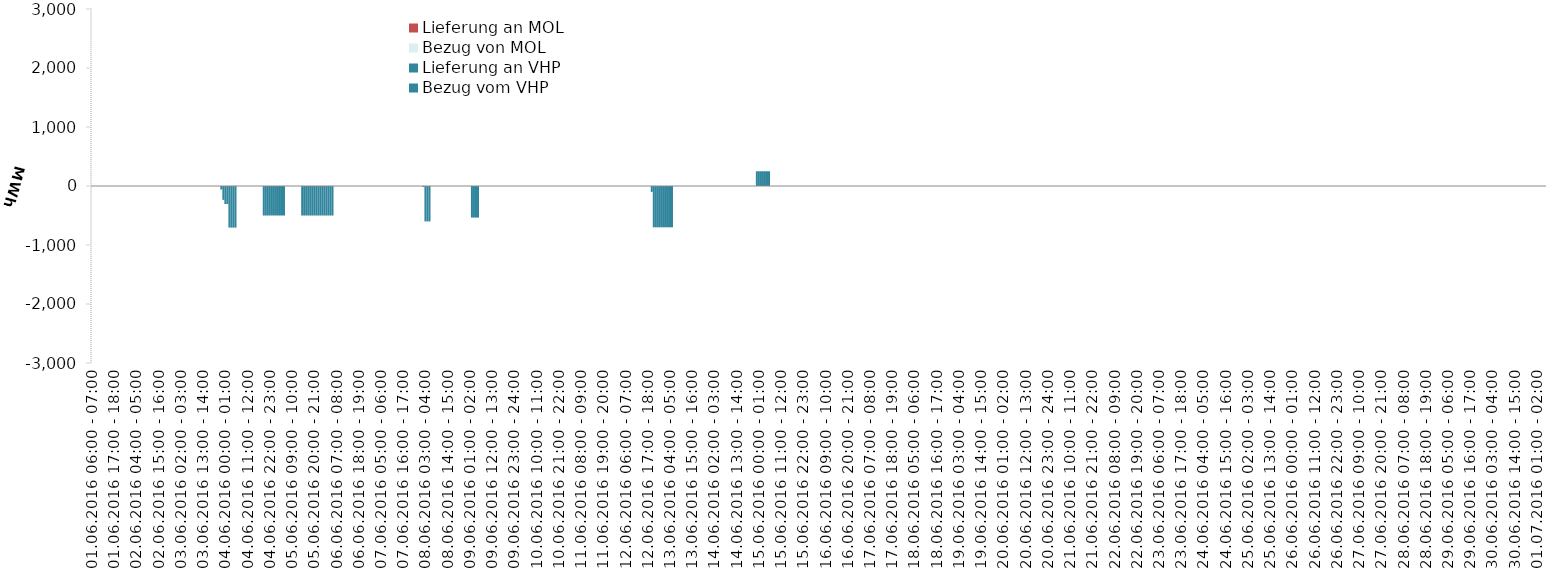
| Category | Bezug vom VHP | Lieferung an VHP | Bezug von MOL | Lieferung an MOL |
|---|---|---|---|---|
| 01.06.2016 06:00 - 07:00 | 0 | 0 | 0 | 0 |
| 01.06.2016 07:00 - 08:00 | 0 | 0 | 0 | 0 |
| 01.06.2016 08:00 - 09:00 | 0 | 0 | 0 | 0 |
| 01.06.2016 09:00 - 10:00 | 0 | 0 | 0 | 0 |
| 01.06.2016 10:00 - 11:00 | 0 | 0 | 0 | 0 |
| 01.06.2016 11:00 - 12:00 | 0 | 0 | 0 | 0 |
| 01.06.2016 12:00 - 13:00 | 0 | 0 | 0 | 0 |
| 01.06.2016 13:00 - 14:00 | 0 | 0 | 0 | 0 |
| 01.06.2016 14:00 - 15:00 | 0 | 0 | 0 | 0 |
| 01.06.2016 15:00 - 16:00 | 0 | 0 | 0 | 0 |
| 01.06.2016 16:00 - 17:00 | 0 | 0 | 0 | 0 |
| 01.06.2016 17:00 - 18:00 | 0 | 0 | 0 | 0 |
| 01.06.2016 18:00 - 19:00 | 0 | 0 | 0 | 0 |
| 01.06.2016 19:00 - 20:00 | 0 | 0 | 0 | 0 |
| 01.06.2016 20:00 - 21:00 | 0 | 0 | 0 | 0 |
| 01.06.2016 21:00 - 22:00 | 0 | 0 | 0 | 0 |
| 01.06.2016 22:00 - 23:00 | 0 | 0 | 0 | 0 |
| 01.06.2016 23:00 - 24:00 | 0 | 0 | 0 | 0 |
| 02.06.2016 00:00 - 01:00 | 0 | 0 | 0 | 0 |
| 02.06.2016 01:00 - 02:00 | 0 | 0 | 0 | 0 |
| 02.06.2016 02:00 - 03:00 | 0 | 0 | 0 | 0 |
| 02.06.2016 03:00 - 04:00 | 0 | 0 | 0 | 0 |
| 02.06.2016 04:00 - 05:00 | 0 | 0 | 0 | 0 |
| 02.06.2016 05:00 - 06:00 | 0 | 0 | 0 | 0 |
| 02.06.2016 06:00 - 07:00 | 0 | 0 | 0 | 0 |
| 02.06.2016 07:00 - 08:00 | 0 | 0 | 0 | 0 |
| 02.06.2016 08:00 - 09:00 | 0 | 0 | 0 | 0 |
| 02.06.2016 09:00 - 10:00 | 0 | 0 | 0 | 0 |
| 02.06.2016 10:00 - 11:00 | 0 | 0 | 0 | 0 |
| 02.06.2016 11:00 - 12:00 | 0 | 0 | 0 | 0 |
| 02.06.2016 12:00 - 13:00 | 0 | 0 | 0 | 0 |
| 02.06.2016 13:00 - 14:00 | 0 | 0 | 0 | 0 |
| 02.06.2016 14:00 - 15:00 | 0 | 0 | 0 | 0 |
| 02.06.2016 15:00 - 16:00 | 0 | 0 | 0 | 0 |
| 02.06.2016 16:00 - 17:00 | 0 | 0 | 0 | 0 |
| 02.06.2016 17:00 - 18:00 | 0 | 0 | 0 | 0 |
| 02.06.2016 18:00 - 19:00 | 0 | 0 | 0 | 0 |
| 02.06.2016 19:00 - 20:00 | 0 | 0 | 0 | 0 |
| 02.06.2016 20:00 - 21:00 | 0 | 0 | 0 | 0 |
| 02.06.2016 21:00 - 22:00 | 0 | 0 | 0 | 0 |
| 02.06.2016 22:00 - 23:00 | 0 | 0 | 0 | 0 |
| 02.06.2016 23:00 - 24:00 | 0 | 0 | 0 | 0 |
| 03.06.2016 00:00 - 01:00 | 0 | 0 | 0 | 0 |
| 03.06.2016 01:00 - 02:00 | 0 | 0 | 0 | 0 |
| 03.06.2016 02:00 - 03:00 | 0 | 0 | 0 | 0 |
| 03.06.2016 03:00 - 04:00 | 0 | 0 | 0 | 0 |
| 03.06.2016 04:00 - 05:00 | 0 | 0 | 0 | 0 |
| 03.06.2016 05:00 - 06:00 | 0 | 0 | 0 | 0 |
| 03.06.2016 06:00 - 07:00 | 0 | 0 | 0 | 0 |
| 03.06.2016 07:00 - 08:00 | 0 | 0 | 0 | 0 |
| 03.06.2016 08:00 - 09:00 | 0 | 0 | 0 | 0 |
| 03.06.2016 09:00 - 10:00 | 0 | 0 | 0 | 0 |
| 03.06.2016 10:00 - 11:00 | 0 | 0 | 0 | 0 |
| 03.06.2016 11:00 - 12:00 | 0 | 0 | 0 | 0 |
| 03.06.2016 12:00 - 13:00 | 0 | 0 | 0 | 0 |
| 03.06.2016 13:00 - 14:00 | 0 | 0 | 0 | 0 |
| 03.06.2016 14:00 - 15:00 | 0 | 0 | 0 | 0 |
| 03.06.2016 15:00 - 16:00 | 0 | 0 | 0 | 0 |
| 03.06.2016 16:00 - 17:00 | 0 | 0 | 0 | 0 |
| 03.06.2016 17:00 - 18:00 | 0 | 0 | 0 | 0 |
| 03.06.2016 18:00 - 19:00 | 0 | 0 | 0 | 0 |
| 03.06.2016 19:00 - 20:00 | 0 | 0 | 0 | 0 |
| 03.06.2016 20:00 - 21:00 | 0 | 0 | 0 | 0 |
| 03.06.2016 21:00 - 22:00 | 0 | 0 | 0 | 0 |
| 03.06.2016 22:00 - 23:00 | 0 | -60 | 0 | 0 |
| 03.06.2016 23:00 - 24:00 | 0 | -235 | 0 | 0 |
| 04.06.2016 00:00 - 01:00 | 0 | -305 | 0 | 0 |
| 04.06.2016 01:00 - 02:00 | 0 | -305 | 0 | 0 |
| 04.06.2016 02:00 - 03:00 | 0 | -705 | 0 | 0 |
| 04.06.2016 03:00 - 04:00 | 0 | -705 | 0 | 0 |
| 04.06.2016 04:00 - 05:00 | 0 | -705 | 0 | 0 |
| 04.06.2016 05:00 - 06:00 | 0 | -705 | 0 | 0 |
| 04.06.2016 06:00 - 07:00 | 0 | 0 | 0 | 0 |
| 04.06.2016 07:00 - 08:00 | 0 | 0 | 0 | 0 |
| 04.06.2016 08:00 - 09:00 | 0 | 0 | 0 | 0 |
| 04.06.2016 09:00 - 10:00 | 0 | 0 | 0 | 0 |
| 04.06.2016 10:00 - 11:00 | 0 | 0 | 0 | 0 |
| 04.06.2016 11:00 - 12:00 | 0 | 0 | 0 | 0 |
| 04.06.2016 12:00 - 13:00 | 0 | 0 | 0 | 0 |
| 04.06.2016 13:00 - 14:00 | 0 | 0 | 0 | 0 |
| 04.06.2016 14:00 - 15:00 | 0 | 0 | 0 | 0 |
| 04.06.2016 15:00 - 16:00 | 0 | 0 | 0 | 0 |
| 04.06.2016 16:00 - 17:00 | 0 | 0 | 0 | 0 |
| 04.06.2016 17:00 - 18:00 | 0 | 0 | 0 | 0 |
| 04.06.2016 18:00 - 19:00 | 0 | 0 | 0 | 0 |
| 04.06.2016 19:00 - 20:00 | 0 | -500 | 0 | 0 |
| 04.06.2016 20:00 - 21:00 | 0 | -500 | 0 | 0 |
| 04.06.2016 21:00 - 22:00 | 0 | -500 | 0 | 0 |
| 04.06.2016 22:00 - 23:00 | 0 | -500 | 0 | 0 |
| 04.06.2016 23:00 - 24:00 | 0 | -500 | 0 | 0 |
| 05.06.2016 00:00 - 01:00 | 0 | -500 | 0 | 0 |
| 05.06.2016 01:00 - 02:00 | 0 | -500 | 0 | 0 |
| 05.06.2016 02:00 - 03:00 | 0 | -500 | 0 | 0 |
| 05.06.2016 03:00 - 04:00 | 0 | -500 | 0 | 0 |
| 05.06.2016 04:00 - 05:00 | 0 | -500 | 0 | 0 |
| 05.06.2016 05:00 - 06:00 | 0 | -500 | 0 | 0 |
| 05.06.2016 06:00 - 07:00 | 0 | 0 | 0 | 0 |
| 05.06.2016 07:00 - 08:00 | 0 | 0 | 0 | 0 |
| 05.06.2016 08:00 - 09:00 | 0 | 0 | 0 | 0 |
| 05.06.2016 09:00 - 10:00 | 0 | 0 | 0 | 0 |
| 05.06.2016 10:00 - 11:00 | 0 | 0 | 0 | 0 |
| 05.06.2016 11:00 - 12:00 | 0 | 0 | 0 | 0 |
| 05.06.2016 12:00 - 13:00 | 0 | 0 | 0 | 0 |
| 05.06.2016 13:00 - 14:00 | 0 | 0 | 0 | 0 |
| 05.06.2016 14:00 - 15:00 | 0 | -500 | 0 | 0 |
| 05.06.2016 15:00 - 16:00 | 0 | -500 | 0 | 0 |
| 05.06.2016 16:00 - 17:00 | 0 | -500 | 0 | 0 |
| 05.06.2016 17:00 - 18:00 | 0 | -500 | 0 | 0 |
| 05.06.2016 18:00 - 19:00 | 0 | -500 | 0 | 0 |
| 05.06.2016 19:00 - 20:00 | 0 | -500 | 0 | 0 |
| 05.06.2016 20:00 - 21:00 | 0 | -500 | 0 | 0 |
| 05.06.2016 21:00 - 22:00 | 0 | -500 | 0 | 0 |
| 05.06.2016 22:00 - 23:00 | 0 | -500 | 0 | 0 |
| 05.06.2016 23:00 - 24:00 | 0 | -500 | 0 | 0 |
| 06.06.2016 00:00 - 01:00 | 0 | -500 | 0 | 0 |
| 06.06.2016 01:00 - 02:00 | 0 | -500 | 0 | 0 |
| 06.06.2016 02:00 - 03:00 | 0 | -500 | 0 | 0 |
| 06.06.2016 03:00 - 04:00 | 0 | -500 | 0 | 0 |
| 06.06.2016 04:00 - 05:00 | 0 | -500 | 0 | 0 |
| 06.06.2016 05:00 - 06:00 | 0 | -500 | 0 | 0 |
| 06.06.2016 06:00 - 07:00 | 0 | 0 | 0 | 0 |
| 06.06.2016 07:00 - 08:00 | 0 | 0 | 0 | 0 |
| 06.06.2016 08:00 - 09:00 | 0 | 0 | 0 | 0 |
| 06.06.2016 09:00 - 10:00 | 0 | 0 | 0 | 0 |
| 06.06.2016 10:00 - 11:00 | 0 | 0 | 0 | 0 |
| 06.06.2016 11:00 - 12:00 | 0 | 0 | 0 | 0 |
| 06.06.2016 12:00 - 13:00 | 0 | 0 | 0 | 0 |
| 06.06.2016 13:00 - 14:00 | 0 | 0 | 0 | 0 |
| 06.06.2016 14:00 - 15:00 | 0 | 0 | 0 | 0 |
| 06.06.2016 15:00 - 16:00 | 0 | 0 | 0 | 0 |
| 06.06.2016 16:00 - 17:00 | 0 | 0 | 0 | 0 |
| 06.06.2016 17:00 - 18:00 | 0 | 0 | 0 | 0 |
| 06.06.2016 18:00 - 19:00 | 0 | 0 | 0 | 0 |
| 06.06.2016 19:00 - 20:00 | 0 | 0 | 0 | 0 |
| 06.06.2016 20:00 - 21:00 | 0 | 0 | 0 | 0 |
| 06.06.2016 21:00 - 22:00 | 0 | 0 | 0 | 0 |
| 06.06.2016 22:00 - 23:00 | 0 | 0 | 0 | 0 |
| 06.06.2016 23:00 - 24:00 | 0 | 0 | 0 | 0 |
| 07.06.2016 00:00 - 01:00 | 0 | 0 | 0 | 0 |
| 07.06.2016 01:00 - 02:00 | 0 | 0 | 0 | 0 |
| 07.06.2016 02:00 - 03:00 | 0 | 0 | 0 | 0 |
| 07.06.2016 03:00 - 04:00 | 0 | 0 | 0 | 0 |
| 07.06.2016 04:00 - 05:00 | 0 | 0 | 0 | 0 |
| 07.06.2016 05:00 - 06:00 | 0 | 0 | 0 | 0 |
| 07.06.2016 06:00 - 07:00 | 0 | 0 | 0 | 0 |
| 07.06.2016 07:00 - 08:00 | 0 | 0 | 0 | 0 |
| 07.06.2016 08:00 - 09:00 | 0 | 0 | 0 | 0 |
| 07.06.2016 09:00 - 10:00 | 0 | 0 | 0 | 0 |
| 07.06.2016 10:00 - 11:00 | 0 | 0 | 0 | 0 |
| 07.06.2016 11:00 - 12:00 | 0 | 0 | 0 | 0 |
| 07.06.2016 12:00 - 13:00 | 0 | 0 | 0 | 0 |
| 07.06.2016 13:00 - 14:00 | 0 | 0 | 0 | 0 |
| 07.06.2016 14:00 - 15:00 | 0 | 0 | 0 | 0 |
| 07.06.2016 15:00 - 16:00 | 0 | 0 | 0 | 0 |
| 07.06.2016 16:00 - 17:00 | 0 | 0 | 0 | 0 |
| 07.06.2016 17:00 - 18:00 | 0 | 0 | 0 | 0 |
| 07.06.2016 18:00 - 19:00 | 0 | 0 | 0 | 0 |
| 07.06.2016 19:00 - 20:00 | 0 | 0 | 0 | 0 |
| 07.06.2016 20:00 - 21:00 | 0 | 0 | 0 | 0 |
| 07.06.2016 21:00 - 22:00 | 0 | 0 | 0 | 0 |
| 07.06.2016 22:00 - 23:00 | 0 | 0 | 0 | 0 |
| 07.06.2016 23:00 - 24:00 | 0 | 0 | 0 | 0 |
| 08.06.2016 00:00 - 01:00 | 0 | 0 | 0 | 0 |
| 08.06.2016 01:00 - 02:00 | 0 | 0 | 0 | 0 |
| 08.06.2016 02:00 - 03:00 | 0 | -16 | 0 | 0 |
| 08.06.2016 03:00 - 04:00 | 0 | -600 | 0 | 0 |
| 08.06.2016 04:00 - 05:00 | 0 | -600 | 0 | 0 |
| 08.06.2016 05:00 - 06:00 | 0 | -600 | 0 | 0 |
| 08.06.2016 06:00 - 07:00 | 0 | 0 | 0 | 0 |
| 08.06.2016 07:00 - 08:00 | 0 | 0 | 0 | 0 |
| 08.06.2016 08:00 - 09:00 | 0 | 0 | 0 | 0 |
| 08.06.2016 09:00 - 10:00 | 0 | 0 | 0 | 0 |
| 08.06.2016 10:00 - 11:00 | 0 | 0 | 0 | 0 |
| 08.06.2016 11:00 - 12:00 | 0 | 0 | 0 | 0 |
| 08.06.2016 12:00 - 13:00 | 0 | 0 | 0 | 0 |
| 08.06.2016 13:00 - 14:00 | 0 | 0 | 0 | 0 |
| 08.06.2016 14:00 - 15:00 | 0 | 0 | 0 | 0 |
| 08.06.2016 15:00 - 16:00 | 0 | 0 | 0 | 0 |
| 08.06.2016 16:00 - 17:00 | 0 | 0 | 0 | 0 |
| 08.06.2016 17:00 - 18:00 | 0 | 0 | 0 | 0 |
| 08.06.2016 18:00 - 19:00 | 0 | 0 | 0 | 0 |
| 08.06.2016 19:00 - 20:00 | 0 | 0 | 0 | 0 |
| 08.06.2016 20:00 - 21:00 | 0 | 0 | 0 | 0 |
| 08.06.2016 21:00 - 22:00 | 0 | 0 | 0 | 0 |
| 08.06.2016 22:00 - 23:00 | 0 | 0 | 0 | 0 |
| 08.06.2016 23:00 - 24:00 | 0 | 0 | 0 | 0 |
| 09.06.2016 00:00 - 01:00 | 0 | 0 | 0 | 0 |
| 09.06.2016 01:00 - 02:00 | 0 | 0 | 0 | 0 |
| 09.06.2016 02:00 - 03:00 | 0 | -535 | 0 | 0 |
| 09.06.2016 03:00 - 04:00 | 0 | -535 | 0 | 0 |
| 09.06.2016 04:00 - 05:00 | 0 | -535 | 0 | 0 |
| 09.06.2016 05:00 - 06:00 | 0 | -535 | 0 | 0 |
| 09.06.2016 06:00 - 07:00 | 0 | 0 | 0 | 0 |
| 09.06.2016 07:00 - 08:00 | 0 | 0 | 0 | 0 |
| 09.06.2016 08:00 - 09:00 | 0 | 0 | 0 | 0 |
| 09.06.2016 09:00 - 10:00 | 0 | 0 | 0 | 0 |
| 09.06.2016 10:00 - 11:00 | 0 | 0 | 0 | 0 |
| 09.06.2016 11:00 - 12:00 | 0 | 0 | 0 | 0 |
| 09.06.2016 12:00 - 13:00 | 0 | 0 | 0 | 0 |
| 09.06.2016 13:00 - 14:00 | 0 | 0 | 0 | 0 |
| 09.06.2016 14:00 - 15:00 | 0 | 0 | 0 | 0 |
| 09.06.2016 15:00 - 16:00 | 0 | 0 | 0 | 0 |
| 09.06.2016 16:00 - 17:00 | 0 | 0 | 0 | 0 |
| 09.06.2016 17:00 - 18:00 | 0 | 0 | 0 | 0 |
| 09.06.2016 18:00 - 19:00 | 0 | 0 | 0 | 0 |
| 09.06.2016 19:00 - 20:00 | 0 | 0 | 0 | 0 |
| 09.06.2016 20:00 - 21:00 | 0 | 0 | 0 | 0 |
| 09.06.2016 21:00 - 22:00 | 0 | 0 | 0 | 0 |
| 09.06.2016 22:00 - 23:00 | 0 | 0 | 0 | 0 |
| 09.06.2016 23:00 - 24:00 | 0 | 0 | 0 | 0 |
| 10.06.2016 00:00 - 01:00 | 0 | 0 | 0 | 0 |
| 10.06.2016 01:00 - 02:00 | 0 | 0 | 0 | 0 |
| 10.06.2016 02:00 - 03:00 | 0 | 0 | 0 | 0 |
| 10.06.2016 03:00 - 04:00 | 0 | 0 | 0 | 0 |
| 10.06.2016 04:00 - 05:00 | 0 | 0 | 0 | 0 |
| 10.06.2016 05:00 - 06:00 | 0 | 0 | 0 | 0 |
| 10.06.2016 06:00 - 07:00 | 0 | 0 | 0 | 0 |
| 10.06.2016 07:00 - 08:00 | 0 | 0 | 0 | 0 |
| 10.06.2016 08:00 - 09:00 | 0 | 0 | 0 | 0 |
| 10.06.2016 09:00 - 10:00 | 0 | 0 | 0 | 0 |
| 10.06.2016 10:00 - 11:00 | 0 | 0 | 0 | 0 |
| 10.06.2016 11:00 - 12:00 | 0 | 0 | 0 | 0 |
| 10.06.2016 12:00 - 13:00 | 0 | 0 | 0 | 0 |
| 10.06.2016 13:00 - 14:00 | 0 | 0 | 0 | 0 |
| 10.06.2016 14:00 - 15:00 | 0 | 0 | 0 | 0 |
| 10.06.2016 15:00 - 16:00 | 0 | 0 | 0 | 0 |
| 10.06.2016 16:00 - 17:00 | 0 | 0 | 0 | 0 |
| 10.06.2016 17:00 - 18:00 | 0 | 0 | 0 | 0 |
| 10.06.2016 18:00 - 19:00 | 0 | 0 | 0 | 0 |
| 10.06.2016 19:00 - 20:00 | 0 | 0 | 0 | 0 |
| 10.06.2016 20:00 - 21:00 | 0 | 0 | 0 | 0 |
| 10.06.2016 21:00 - 22:00 | 0 | 0 | 0 | 0 |
| 10.06.2016 22:00 - 23:00 | 0 | 0 | 0 | 0 |
| 10.06.2016 23:00 - 24:00 | 0 | 0 | 0 | 0 |
| 11.06.2016 00:00 - 01:00 | 0 | 0 | 0 | 0 |
| 11.06.2016 01:00 - 02:00 | 0 | 0 | 0 | 0 |
| 11.06.2016 02:00 - 03:00 | 0 | 0 | 0 | 0 |
| 11.06.2016 03:00 - 04:00 | 0 | 0 | 0 | 0 |
| 11.06.2016 04:00 - 05:00 | 0 | 0 | 0 | 0 |
| 11.06.2016 05:00 - 06:00 | 0 | 0 | 0 | 0 |
| 11.06.2016 06:00 - 07:00 | 0 | 0 | 0 | 0 |
| 11.06.2016 07:00 - 08:00 | 0 | 0 | 0 | 0 |
| 11.06.2016 08:00 - 09:00 | 0 | 0 | 0 | 0 |
| 11.06.2016 09:00 - 10:00 | 0 | 0 | 0 | 0 |
| 11.06.2016 10:00 - 11:00 | 0 | 0 | 0 | 0 |
| 11.06.2016 11:00 - 12:00 | 0 | 0 | 0 | 0 |
| 11.06.2016 12:00 - 13:00 | 0 | 0 | 0 | 0 |
| 11.06.2016 13:00 - 14:00 | 0 | 0 | 0 | 0 |
| 11.06.2016 14:00 - 15:00 | 0 | 0 | 0 | 0 |
| 11.06.2016 15:00 - 16:00 | 0 | 0 | 0 | 0 |
| 11.06.2016 16:00 - 17:00 | 0 | 0 | 0 | 0 |
| 11.06.2016 17:00 - 18:00 | 0 | 0 | 0 | 0 |
| 11.06.2016 18:00 - 19:00 | 0 | 0 | 0 | 0 |
| 11.06.2016 19:00 - 20:00 | 0 | 0 | 0 | 0 |
| 11.06.2016 20:00 - 21:00 | 0 | 0 | 0 | 0 |
| 11.06.2016 21:00 - 22:00 | 0 | 0 | 0 | 0 |
| 11.06.2016 22:00 - 23:00 | 0 | 0 | 0 | 0 |
| 11.06.2016 23:00 - 24:00 | 0 | 0 | 0 | 0 |
| 12.06.2016 00:00 - 01:00 | 0 | 0 | 0 | 0 |
| 12.06.2016 01:00 - 02:00 | 0 | 0 | 0 | 0 |
| 12.06.2016 02:00 - 03:00 | 0 | 0 | 0 | 0 |
| 12.06.2016 03:00 - 04:00 | 0 | 0 | 0 | 0 |
| 12.06.2016 04:00 - 05:00 | 0 | 0 | 0 | 0 |
| 12.06.2016 05:00 - 06:00 | 0 | 0 | 0 | 0 |
| 12.06.2016 06:00 - 07:00 | 0 | 0 | 0 | 0 |
| 12.06.2016 07:00 - 08:00 | 0 | 0 | 0 | 0 |
| 12.06.2016 08:00 - 09:00 | 0 | 0 | 0 | 0 |
| 12.06.2016 09:00 - 10:00 | 0 | 0 | 0 | 0 |
| 12.06.2016 10:00 - 11:00 | 0 | 0 | 0 | 0 |
| 12.06.2016 11:00 - 12:00 | 0 | 0 | 0 | 0 |
| 12.06.2016 12:00 - 13:00 | 0 | 0 | 0 | 0 |
| 12.06.2016 13:00 - 14:00 | 0 | 0 | 0 | 0 |
| 12.06.2016 14:00 - 15:00 | 0 | 0 | 0 | 0 |
| 12.06.2016 15:00 - 16:00 | 0 | 0 | 0 | 0 |
| 12.06.2016 16:00 - 17:00 | 0 | 0 | 0 | 0 |
| 12.06.2016 17:00 - 18:00 | 0 | 0 | 0 | 0 |
| 12.06.2016 18:00 - 19:00 | 0 | 0 | 0 | 0 |
| 12.06.2016 19:00 - 20:00 | 0 | -100 | 0 | 0 |
| 12.06.2016 20:00 - 21:00 | 0 | -700 | 0 | 0 |
| 12.06.2016 21:00 - 22:00 | 0 | -700 | 0 | 0 |
| 12.06.2016 22:00 - 23:00 | 0 | -700 | 0 | 0 |
| 12.06.2016 23:00 - 24:00 | 0 | -700 | 0 | 0 |
| 13.06.2016 00:00 - 01:00 | 0 | -700 | 0 | 0 |
| 13.06.2016 01:00 - 02:00 | 0 | -700 | 0 | 0 |
| 13.06.2016 02:00 - 03:00 | 0 | -700 | 0 | 0 |
| 13.06.2016 03:00 - 04:00 | 0 | -700 | 0 | 0 |
| 13.06.2016 04:00 - 05:00 | 0 | -700 | 0 | 0 |
| 13.06.2016 05:00 - 06:00 | 0 | -700 | 0 | 0 |
| 13.06.2016 06:00 - 07:00 | 0 | 0 | 0 | 0 |
| 13.06.2016 07:00 - 08:00 | 0 | 0 | 0 | 0 |
| 13.06.2016 08:00 - 09:00 | 0 | 0 | 0 | 0 |
| 13.06.2016 09:00 - 10:00 | 0 | 0 | 0 | 0 |
| 13.06.2016 10:00 - 11:00 | 0 | 0 | 0 | 0 |
| 13.06.2016 11:00 - 12:00 | 0 | 0 | 0 | 0 |
| 13.06.2016 12:00 - 13:00 | 0 | 0 | 0 | 0 |
| 13.06.2016 13:00 - 14:00 | 0 | 0 | 0 | 0 |
| 13.06.2016 14:00 - 15:00 | 0 | 0 | 0 | 0 |
| 13.06.2016 15:00 - 16:00 | 0 | 0 | 0 | 0 |
| 13.06.2016 16:00 - 17:00 | 0 | 0 | 0 | 0 |
| 13.06.2016 17:00 - 18:00 | 0 | 0 | 0 | 0 |
| 13.06.2016 18:00 - 19:00 | 0 | 0 | 0 | 0 |
| 13.06.2016 19:00 - 20:00 | 0 | 0 | 0 | 0 |
| 13.06.2016 20:00 - 21:00 | 0 | 0 | 0 | 0 |
| 13.06.2016 21:00 - 22:00 | 0 | 0 | 0 | 0 |
| 13.06.2016 22:00 - 23:00 | 0 | 0 | 0 | 0 |
| 13.06.2016 23:00 - 24:00 | 0 | 0 | 0 | 0 |
| 14.06.2016 00:00 - 01:00 | 0 | 0 | 0 | 0 |
| 14.06.2016 01:00 - 02:00 | 0 | 0 | 0 | 0 |
| 14.06.2016 02:00 - 03:00 | 0 | 0 | 0 | 0 |
| 14.06.2016 03:00 - 04:00 | 0 | 0 | 0 | 0 |
| 14.06.2016 04:00 - 05:00 | 0 | 0 | 0 | 0 |
| 14.06.2016 05:00 - 06:00 | 0 | 0 | 0 | 0 |
| 14.06.2016 06:00 - 07:00 | 0 | 0 | 0 | 0 |
| 14.06.2016 07:00 - 08:00 | 0 | 0 | 0 | 0 |
| 14.06.2016 08:00 - 09:00 | 0 | 0 | 0 | 0 |
| 14.06.2016 09:00 - 10:00 | 0 | 0 | 0 | 0 |
| 14.06.2016 10:00 - 11:00 | 0 | 0 | 0 | 0 |
| 14.06.2016 11:00 - 12:00 | 0 | 0 | 0 | 0 |
| 14.06.2016 12:00 - 13:00 | 0 | 0 | 0 | 0 |
| 14.06.2016 13:00 - 14:00 | 0 | 0 | 0 | 0 |
| 14.06.2016 14:00 - 15:00 | 0 | 0 | 0 | 0 |
| 14.06.2016 15:00 - 16:00 | 0 | 0 | 0 | 0 |
| 14.06.2016 16:00 - 17:00 | 0 | 0 | 0 | 0 |
| 14.06.2016 17:00 - 18:00 | 0 | 0 | 0 | 0 |
| 14.06.2016 18:00 - 19:00 | 0 | 0 | 0 | 0 |
| 14.06.2016 19:00 - 20:00 | 0 | 0 | 0 | 0 |
| 14.06.2016 20:00 - 21:00 | 0 | 0 | 0 | 0 |
| 14.06.2016 21:00 - 22:00 | 0 | 0 | 0 | 0 |
| 14.06.2016 22:00 - 23:00 | 0 | 0 | 0 | 0 |
| 14.06.2016 23:00 - 24:00 | 250 | 0 | 0 | 0 |
| 15.06.2016 00:00 - 01:00 | 250 | 0 | 0 | 0 |
| 15.06.2016 01:00 - 02:00 | 250 | 0 | 0 | 0 |
| 15.06.2016 02:00 - 03:00 | 250 | 0 | 0 | 0 |
| 15.06.2016 03:00 - 04:00 | 250 | 0 | 0 | 0 |
| 15.06.2016 04:00 - 05:00 | 250 | 0 | 0 | 0 |
| 15.06.2016 05:00 - 06:00 | 250 | 0 | 0 | 0 |
| 15.06.2016 06:00 - 07:00 | 0 | 0 | 0 | 0 |
| 15.06.2016 07:00 - 08:00 | 0 | 0 | 0 | 0 |
| 15.06.2016 08:00 - 09:00 | 0 | 0 | 0 | 0 |
| 15.06.2016 09:00 - 10:00 | 0 | 0 | 0 | 0 |
| 15.06.2016 10:00 - 11:00 | 0 | 0 | 0 | 0 |
| 15.06.2016 11:00 - 12:00 | 0 | 0 | 0 | 0 |
| 15.06.2016 12:00 - 13:00 | 0 | 0 | 0 | 0 |
| 15.06.2016 13:00 - 14:00 | 0 | 0 | 0 | 0 |
| 15.06.2016 14:00 - 15:00 | 0 | 0 | 0 | 0 |
| 15.06.2016 15:00 - 16:00 | 0 | 0 | 0 | 0 |
| 15.06.2016 16:00 - 17:00 | 0 | 0 | 0 | 0 |
| 15.06.2016 17:00 - 18:00 | 0 | 0 | 0 | 0 |
| 15.06.2016 18:00 - 19:00 | 0 | 0 | 0 | 0 |
| 15.06.2016 19:00 - 20:00 | 0 | 0 | 0 | 0 |
| 15.06.2016 20:00 - 21:00 | 0 | 0 | 0 | 0 |
| 15.06.2016 21:00 - 22:00 | 0 | 0 | 0 | 0 |
| 15.06.2016 22:00 - 23:00 | 0 | 0 | 0 | 0 |
| 15.06.2016 23:00 - 24:00 | 0 | 0 | 0 | 0 |
| 16.06.2016 00:00 - 01:00 | 0 | 0 | 0 | 0 |
| 16.06.2016 01:00 - 02:00 | 0 | 0 | 0 | 0 |
| 16.06.2016 02:00 - 03:00 | 0 | 0 | 0 | 0 |
| 16.06.2016 03:00 - 04:00 | 0 | 0 | 0 | 0 |
| 16.06.2016 04:00 - 05:00 | 0 | 0 | 0 | 0 |
| 16.06.2016 05:00 - 06:00 | 0 | 0 | 0 | 0 |
| 16.06.2016 06:00 - 07:00 | 0 | 0 | 0 | 0 |
| 16.06.2016 07:00 - 08:00 | 0 | 0 | 0 | 0 |
| 16.06.2016 08:00 - 09:00 | 0 | 0 | 0 | 0 |
| 16.06.2016 09:00 - 10:00 | 0 | 0 | 0 | 0 |
| 16.06.2016 10:00 - 11:00 | 0 | 0 | 0 | 0 |
| 16.06.2016 11:00 - 12:00 | 0 | 0 | 0 | 0 |
| 16.06.2016 12:00 - 13:00 | 0 | 0 | 0 | 0 |
| 16.06.2016 13:00 - 14:00 | 0 | 0 | 0 | 0 |
| 16.06.2016 14:00 - 15:00 | 0 | 0 | 0 | 0 |
| 16.06.2016 15:00 - 16:00 | 0 | 0 | 0 | 0 |
| 16.06.2016 16:00 - 17:00 | 0 | 0 | 0 | 0 |
| 16.06.2016 17:00 - 18:00 | 0 | 0 | 0 | 0 |
| 16.06.2016 18:00 - 19:00 | 0 | 0 | 0 | 0 |
| 16.06.2016 19:00 - 20:00 | 0 | 0 | 0 | 0 |
| 16.06.2016 20:00 - 21:00 | 0 | 0 | 0 | 0 |
| 16.06.2016 21:00 - 22:00 | 0 | 0 | 0 | 0 |
| 16.06.2016 22:00 - 23:00 | 0 | 0 | 0 | 0 |
| 16.06.2016 23:00 - 24:00 | 0 | 0 | 0 | 0 |
| 17.06.2016 00:00 - 01:00 | 0 | 0 | 0 | 0 |
| 17.06.2016 01:00 - 02:00 | 0 | 0 | 0 | 0 |
| 17.06.2016 02:00 - 03:00 | 0 | 0 | 0 | 0 |
| 17.06.2016 03:00 - 04:00 | 0 | 0 | 0 | 0 |
| 17.06.2016 04:00 - 05:00 | 0 | 0 | 0 | 0 |
| 17.06.2016 05:00 - 06:00 | 0 | 0 | 0 | 0 |
| 17.06.2016 06:00 - 07:00 | 0 | 0 | 0 | 0 |
| 17.06.2016 07:00 - 08:00 | 0 | 0 | 0 | 0 |
| 17.06.2016 08:00 - 09:00 | 0 | 0 | 0 | 0 |
| 17.06.2016 09:00 - 10:00 | 0 | 0 | 0 | 0 |
| 17.06.2016 10:00 - 11:00 | 0 | 0 | 0 | 0 |
| 17.06.2016 11:00 - 12:00 | 0 | 0 | 0 | 0 |
| 17.06.2016 12:00 - 13:00 | 0 | 0 | 0 | 0 |
| 17.06.2016 13:00 - 14:00 | 0 | 0 | 0 | 0 |
| 17.06.2016 14:00 - 15:00 | 0 | 0 | 0 | 0 |
| 17.06.2016 15:00 - 16:00 | 0 | 0 | 0 | 0 |
| 17.06.2016 16:00 - 17:00 | 0 | 0 | 0 | 0 |
| 17.06.2016 17:00 - 18:00 | 0 | 0 | 0 | 0 |
| 17.06.2016 18:00 - 19:00 | 0 | 0 | 0 | 0 |
| 17.06.2016 19:00 - 20:00 | 0 | 0 | 0 | 0 |
| 17.06.2016 20:00 - 21:00 | 0 | 0 | 0 | 0 |
| 17.06.2016 21:00 - 22:00 | 0 | 0 | 0 | 0 |
| 17.06.2016 22:00 - 23:00 | 0 | 0 | 0 | 0 |
| 17.06.2016 23:00 - 24:00 | 0 | 0 | 0 | 0 |
| 18.06.2016 00:00 - 01:00 | 0 | 0 | 0 | 0 |
| 18.06.2016 01:00 - 02:00 | 0 | 0 | 0 | 0 |
| 18.06.2016 02:00 - 03:00 | 0 | 0 | 0 | 0 |
| 18.06.2016 03:00 - 04:00 | 0 | 0 | 0 | 0 |
| 18.06.2016 04:00 - 05:00 | 0 | 0 | 0 | 0 |
| 18.06.2016 05:00 - 06:00 | 0 | 0 | 0 | 0 |
| 18.06.2016 06:00 - 07:00 | 0 | 0 | 0 | 0 |
| 18.06.2016 07:00 - 08:00 | 0 | 0 | 0 | 0 |
| 18.06.2016 08:00 - 09:00 | 0 | 0 | 0 | 0 |
| 18.06.2016 09:00 - 10:00 | 0 | 0 | 0 | 0 |
| 18.06.2016 10:00 - 11:00 | 0 | 0 | 0 | 0 |
| 18.06.2016 11:00 - 12:00 | 0 | 0 | 0 | 0 |
| 18.06.2016 12:00 - 13:00 | 0 | 0 | 0 | 0 |
| 18.06.2016 13:00 - 14:00 | 0 | 0 | 0 | 0 |
| 18.06.2016 14:00 - 15:00 | 0 | 0 | 0 | 0 |
| 18.06.2016 15:00 - 16:00 | 0 | 0 | 0 | 0 |
| 18.06.2016 16:00 - 17:00 | 0 | 0 | 0 | 0 |
| 18.06.2016 17:00 - 18:00 | 0 | 0 | 0 | 0 |
| 18.06.2016 18:00 - 19:00 | 0 | 0 | 0 | 0 |
| 18.06.2016 19:00 - 20:00 | 0 | 0 | 0 | 0 |
| 18.06.2016 20:00 - 21:00 | 0 | 0 | 0 | 0 |
| 18.06.2016 21:00 - 22:00 | 0 | 0 | 0 | 0 |
| 18.06.2016 22:00 - 23:00 | 0 | 0 | 0 | 0 |
| 18.06.2016 23:00 - 24:00 | 0 | 0 | 0 | 0 |
| 19.06.2016 00:00 - 01:00 | 0 | 0 | 0 | 0 |
| 19.06.2016 01:00 - 02:00 | 0 | 0 | 0 | 0 |
| 19.06.2016 02:00 - 03:00 | 0 | 0 | 0 | 0 |
| 19.06.2016 03:00 - 04:00 | 0 | 0 | 0 | 0 |
| 19.06.2016 04:00 - 05:00 | 0 | 0 | 0 | 0 |
| 19.06.2016 05:00 - 06:00 | 0 | 0 | 0 | 0 |
| 19.06.2016 06:00 - 07:00 | 0 | 0 | 0 | 0 |
| 19.06.2016 07:00 - 08:00 | 0 | 0 | 0 | 0 |
| 19.06.2016 08:00 - 09:00 | 0 | 0 | 0 | 0 |
| 19.06.2016 09:00 - 10:00 | 0 | 0 | 0 | 0 |
| 19.06.2016 10:00 - 11:00 | 0 | 0 | 0 | 0 |
| 19.06.2016 11:00 - 12:00 | 0 | 0 | 0 | 0 |
| 19.06.2016 12:00 - 13:00 | 0 | 0 | 0 | 0 |
| 19.06.2016 13:00 - 14:00 | 0 | 0 | 0 | 0 |
| 19.06.2016 14:00 - 15:00 | 0 | 0 | 0 | 0 |
| 19.06.2016 15:00 - 16:00 | 0 | 0 | 0 | 0 |
| 19.06.2016 16:00 - 17:00 | 0 | 0 | 0 | 0 |
| 19.06.2016 17:00 - 18:00 | 0 | 0 | 0 | 0 |
| 19.06.2016 18:00 - 19:00 | 0 | 0 | 0 | 0 |
| 19.06.2016 19:00 - 20:00 | 0 | 0 | 0 | 0 |
| 19.06.2016 20:00 - 21:00 | 0 | 0 | 0 | 0 |
| 19.06.2016 21:00 - 22:00 | 0 | 0 | 0 | 0 |
| 19.06.2016 22:00 - 23:00 | 0 | 0 | 0 | 0 |
| 19.06.2016 23:00 - 24:00 | 0 | 0 | 0 | 0 |
| 20.06.2016 00:00 - 01:00 | 0 | 0 | 0 | 0 |
| 20.06.2016 01:00 - 02:00 | 0 | 0 | 0 | 0 |
| 20.06.2016 02:00 - 03:00 | 0 | 0 | 0 | 0 |
| 20.06.2016 03:00 - 04:00 | 0 | 0 | 0 | 0 |
| 20.06.2016 04:00 - 05:00 | 0 | 0 | 0 | 0 |
| 20.06.2016 05:00 - 06:00 | 0 | 0 | 0 | 0 |
| 20.06.2016 06:00 - 07:00 | 0 | 0 | 0 | 0 |
| 20.06.2016 07:00 - 08:00 | 0 | 0 | 0 | 0 |
| 20.06.2016 08:00 - 09:00 | 0 | 0 | 0 | 0 |
| 20.06.2016 09:00 - 10:00 | 0 | 0 | 0 | 0 |
| 20.06.2016 10:00 - 11:00 | 0 | 0 | 0 | 0 |
| 20.06.2016 11:00 - 12:00 | 0 | 0 | 0 | 0 |
| 20.06.2016 12:00 - 13:00 | 0 | 0 | 0 | 0 |
| 20.06.2016 13:00 - 14:00 | 0 | 0 | 0 | 0 |
| 20.06.2016 14:00 - 15:00 | 0 | 0 | 0 | 0 |
| 20.06.2016 15:00 - 16:00 | 0 | 0 | 0 | 0 |
| 20.06.2016 16:00 - 17:00 | 0 | 0 | 0 | 0 |
| 20.06.2016 17:00 - 18:00 | 0 | 0 | 0 | 0 |
| 20.06.2016 18:00 - 19:00 | 0 | 0 | 0 | 0 |
| 20.06.2016 19:00 - 20:00 | 0 | 0 | 0 | 0 |
| 20.06.2016 20:00 - 21:00 | 0 | 0 | 0 | 0 |
| 20.06.2016 21:00 - 22:00 | 0 | 0 | 0 | 0 |
| 20.06.2016 22:00 - 23:00 | 0 | 0 | 0 | 0 |
| 20.06.2016 23:00 - 24:00 | 0 | 0 | 0 | 0 |
| 21.06.2016 00:00 - 01:00 | 0 | 0 | 0 | 0 |
| 21.06.2016 01:00 - 02:00 | 0 | 0 | 0 | 0 |
| 21.06.2016 02:00 - 03:00 | 0 | 0 | 0 | 0 |
| 21.06.2016 03:00 - 04:00 | 0 | 0 | 0 | 0 |
| 21.06.2016 04:00 - 05:00 | 0 | 0 | 0 | 0 |
| 21.06.2016 05:00 - 06:00 | 0 | 0 | 0 | 0 |
| 21.06.2016 06:00 - 07:00 | 0 | 0 | 0 | 0 |
| 21.06.2016 07:00 - 08:00 | 0 | 0 | 0 | 0 |
| 21.06.2016 08:00 - 09:00 | 0 | 0 | 0 | 0 |
| 21.06.2016 09:00 - 10:00 | 0 | 0 | 0 | 0 |
| 21.06.2016 10:00 - 11:00 | 0 | 0 | 0 | 0 |
| 21.06.2016 11:00 - 12:00 | 0 | 0 | 0 | 0 |
| 21.06.2016 12:00 - 13:00 | 0 | 0 | 0 | 0 |
| 21.06.2016 13:00 - 14:00 | 0 | 0 | 0 | 0 |
| 21.06.2016 14:00 - 15:00 | 0 | 0 | 0 | 0 |
| 21.06.2016 15:00 - 16:00 | 0 | 0 | 0 | 0 |
| 21.06.2016 16:00 - 17:00 | 0 | 0 | 0 | 0 |
| 21.06.2016 17:00 - 18:00 | 0 | 0 | 0 | 0 |
| 21.06.2016 18:00 - 19:00 | 0 | 0 | 0 | 0 |
| 21.06.2016 19:00 - 20:00 | 0 | 0 | 0 | 0 |
| 21.06.2016 20:00 - 21:00 | 0 | 0 | 0 | 0 |
| 21.06.2016 21:00 - 22:00 | 0 | 0 | 0 | 0 |
| 21.06.2016 22:00 - 23:00 | 0 | 0 | 0 | 0 |
| 21.06.2016 23:00 - 24:00 | 0 | 0 | 0 | 0 |
| 22.06.2016 00:00 - 01:00 | 0 | 0 | 0 | 0 |
| 22.06.2016 01:00 - 02:00 | 0 | 0 | 0 | 0 |
| 22.06.2016 02:00 - 03:00 | 0 | 0 | 0 | 0 |
| 22.06.2016 03:00 - 04:00 | 0 | 0 | 0 | 0 |
| 22.06.2016 04:00 - 05:00 | 0 | 0 | 0 | 0 |
| 22.06.2016 05:00 - 06:00 | 0 | 0 | 0 | 0 |
| 22.06.2016 06:00 - 07:00 | 0 | 0 | 0 | 0 |
| 22.06.2016 07:00 - 08:00 | 0 | 0 | 0 | 0 |
| 22.06.2016 08:00 - 09:00 | 0 | 0 | 0 | 0 |
| 22.06.2016 09:00 - 10:00 | 0 | 0 | 0 | 0 |
| 22.06.2016 10:00 - 11:00 | 0 | 0 | 0 | 0 |
| 22.06.2016 11:00 - 12:00 | 0 | 0 | 0 | 0 |
| 22.06.2016 12:00 - 13:00 | 0 | 0 | 0 | 0 |
| 22.06.2016 13:00 - 14:00 | 0 | 0 | 0 | 0 |
| 22.06.2016 14:00 - 15:00 | 0 | 0 | 0 | 0 |
| 22.06.2016 15:00 - 16:00 | 0 | 0 | 0 | 0 |
| 22.06.2016 16:00 - 17:00 | 0 | 0 | 0 | 0 |
| 22.06.2016 17:00 - 18:00 | 0 | 0 | 0 | 0 |
| 22.06.2016 18:00 - 19:00 | 0 | 0 | 0 | 0 |
| 22.06.2016 19:00 - 20:00 | 0 | 0 | 0 | 0 |
| 22.06.2016 20:00 - 21:00 | 0 | 0 | 0 | 0 |
| 22.06.2016 21:00 - 22:00 | 0 | 0 | 0 | 0 |
| 22.06.2016 22:00 - 23:00 | 0 | 0 | 0 | 0 |
| 22.06.2016 23:00 - 24:00 | 0 | 0 | 0 | 0 |
| 23.06.2016 00:00 - 01:00 | 0 | 0 | 0 | 0 |
| 23.06.2016 01:00 - 02:00 | 0 | 0 | 0 | 0 |
| 23.06.2016 02:00 - 03:00 | 0 | 0 | 0 | 0 |
| 23.06.2016 03:00 - 04:00 | 0 | 0 | 0 | 0 |
| 23.06.2016 04:00 - 05:00 | 0 | 0 | 0 | 0 |
| 23.06.2016 05:00 - 06:00 | 0 | 0 | 0 | 0 |
| 23.06.2016 06:00 - 07:00 | 0 | 0 | 0 | 0 |
| 23.06.2016 07:00 - 08:00 | 0 | 0 | 0 | 0 |
| 23.06.2016 08:00 - 09:00 | 0 | 0 | 0 | 0 |
| 23.06.2016 09:00 - 10:00 | 0 | 0 | 0 | 0 |
| 23.06.2016 10:00 - 11:00 | 0 | 0 | 0 | 0 |
| 23.06.2016 11:00 - 12:00 | 0 | 0 | 0 | 0 |
| 23.06.2016 12:00 - 13:00 | 0 | 0 | 0 | 0 |
| 23.06.2016 13:00 - 14:00 | 0 | 0 | 0 | 0 |
| 23.06.2016 14:00 - 15:00 | 0 | 0 | 0 | 0 |
| 23.06.2016 15:00 - 16:00 | 0 | 0 | 0 | 0 |
| 23.06.2016 16:00 - 17:00 | 0 | 0 | 0 | 0 |
| 23.06.2016 17:00 - 18:00 | 0 | 0 | 0 | 0 |
| 23.06.2016 18:00 - 19:00 | 0 | 0 | 0 | 0 |
| 23.06.2016 19:00 - 20:00 | 0 | 0 | 0 | 0 |
| 23.06.2016 20:00 - 21:00 | 0 | 0 | 0 | 0 |
| 23.06.2016 21:00 - 22:00 | 0 | 0 | 0 | 0 |
| 23.06.2016 22:00 - 23:00 | 0 | 0 | 0 | 0 |
| 23.06.2016 23:00 - 24:00 | 0 | 0 | 0 | 0 |
| 24.06.2016 00:00 - 01:00 | 0 | 0 | 0 | 0 |
| 24.06.2016 01:00 - 02:00 | 0 | 0 | 0 | 0 |
| 24.06.2016 02:00 - 03:00 | 0 | 0 | 0 | 0 |
| 24.06.2016 03:00 - 04:00 | 0 | 0 | 0 | 0 |
| 24.06.2016 04:00 - 05:00 | 0 | 0 | 0 | 0 |
| 24.06.2016 05:00 - 06:00 | 0 | 0 | 0 | 0 |
| 24.06.2016 06:00 - 07:00 | 0 | 0 | 0 | 0 |
| 24.06.2016 07:00 - 08:00 | 0 | 0 | 0 | 0 |
| 24.06.2016 08:00 - 09:00 | 0 | 0 | 0 | 0 |
| 24.06.2016 09:00 - 10:00 | 0 | 0 | 0 | 0 |
| 24.06.2016 10:00 - 11:00 | 0 | 0 | 0 | 0 |
| 24.06.2016 11:00 - 12:00 | 0 | 0 | 0 | 0 |
| 24.06.2016 12:00 - 13:00 | 0 | 0 | 0 | 0 |
| 24.06.2016 13:00 - 14:00 | 0 | 0 | 0 | 0 |
| 24.06.2016 14:00 - 15:00 | 0 | 0 | 0 | 0 |
| 24.06.2016 15:00 - 16:00 | 0 | 0 | 0 | 0 |
| 24.06.2016 16:00 - 17:00 | 0 | 0 | 0 | 0 |
| 24.06.2016 17:00 - 18:00 | 0 | 0 | 0 | 0 |
| 24.06.2016 18:00 - 19:00 | 0 | 0 | 0 | 0 |
| 24.06.2016 19:00 - 20:00 | 0 | 0 | 0 | 0 |
| 24.06.2016 20:00 - 21:00 | 0 | 0 | 0 | 0 |
| 24.06.2016 21:00 - 22:00 | 0 | 0 | 0 | 0 |
| 24.06.2016 22:00 - 23:00 | 0 | 0 | 0 | 0 |
| 24.06.2016 23:00 - 24:00 | 0 | 0 | 0 | 0 |
| 25.06.2016 00:00 - 01:00 | 0 | 0 | 0 | 0 |
| 25.06.2016 01:00 - 02:00 | 0 | 0 | 0 | 0 |
| 25.06.2016 02:00 - 03:00 | 0 | 0 | 0 | 0 |
| 25.06.2016 03:00 - 04:00 | 0 | 0 | 0 | 0 |
| 25.06.2016 04:00 - 05:00 | 0 | 0 | 0 | 0 |
| 25.06.2016 05:00 - 06:00 | 0 | 0 | 0 | 0 |
| 25.06.2016 06:00 - 07:00 | 0 | 0 | 0 | 0 |
| 25.06.2016 07:00 - 08:00 | 0 | 0 | 0 | 0 |
| 25.06.2016 08:00 - 09:00 | 0 | 0 | 0 | 0 |
| 25.06.2016 09:00 - 10:00 | 0 | 0 | 0 | 0 |
| 25.06.2016 10:00 - 11:00 | 0 | 0 | 0 | 0 |
| 25.06.2016 11:00 - 12:00 | 0 | 0 | 0 | 0 |
| 25.06.2016 12:00 - 13:00 | 0 | 0 | 0 | 0 |
| 25.06.2016 13:00 - 14:00 | 0 | 0 | 0 | 0 |
| 25.06.2016 14:00 - 15:00 | 0 | 0 | 0 | 0 |
| 25.06.2016 15:00 - 16:00 | 0 | 0 | 0 | 0 |
| 25.06.2016 16:00 - 17:00 | 0 | 0 | 0 | 0 |
| 25.06.2016 17:00 - 18:00 | 0 | 0 | 0 | 0 |
| 25.06.2016 18:00 - 19:00 | 0 | 0 | 0 | 0 |
| 25.06.2016 19:00 - 20:00 | 0 | 0 | 0 | 0 |
| 25.06.2016 20:00 - 21:00 | 0 | 0 | 0 | 0 |
| 25.06.2016 21:00 - 22:00 | 0 | 0 | 0 | 0 |
| 25.06.2016 22:00 - 23:00 | 0 | 0 | 0 | 0 |
| 25.06.2016 23:00 - 24:00 | 0 | 0 | 0 | 0 |
| 26.06.2016 00:00 - 01:00 | 0 | 0 | 0 | 0 |
| 26.06.2016 01:00 - 02:00 | 0 | 0 | 0 | 0 |
| 26.06.2016 02:00 - 03:00 | 0 | 0 | 0 | 0 |
| 26.06.2016 03:00 - 04:00 | 0 | 0 | 0 | 0 |
| 26.06.2016 04:00 - 05:00 | 0 | 0 | 0 | 0 |
| 26.06.2016 05:00 - 06:00 | 0 | 0 | 0 | 0 |
| 26.06.2016 06:00 - 07:00 | 0 | 0 | 0 | 0 |
| 26.06.2016 07:00 - 08:00 | 0 | 0 | 0 | 0 |
| 26.06.2016 08:00 - 09:00 | 0 | 0 | 0 | 0 |
| 26.06.2016 09:00 - 10:00 | 0 | 0 | 0 | 0 |
| 26.06.2016 10:00 - 11:00 | 0 | 0 | 0 | 0 |
| 26.06.2016 11:00 - 12:00 | 0 | 0 | 0 | 0 |
| 26.06.2016 12:00 - 13:00 | 0 | 0 | 0 | 0 |
| 26.06.2016 13:00 - 14:00 | 0 | 0 | 0 | 0 |
| 26.06.2016 14:00 - 15:00 | 0 | 0 | 0 | 0 |
| 26.06.2016 15:00 - 16:00 | 0 | 0 | 0 | 0 |
| 26.06.2016 16:00 - 17:00 | 0 | 0 | 0 | 0 |
| 26.06.2016 17:00 - 18:00 | 0 | 0 | 0 | 0 |
| 26.06.2016 18:00 - 19:00 | 0 | 0 | 0 | 0 |
| 26.06.2016 19:00 - 20:00 | 0 | 0 | 0 | 0 |
| 26.06.2016 20:00 - 21:00 | 0 | 0 | 0 | 0 |
| 26.06.2016 21:00 - 22:00 | 0 | 0 | 0 | 0 |
| 26.06.2016 22:00 - 23:00 | 0 | 0 | 0 | 0 |
| 26.06.2016 23:00 - 24:00 | 0 | 0 | 0 | 0 |
| 27.06.2016 00:00 - 01:00 | 0 | 0 | 0 | 0 |
| 27.06.2016 01:00 - 02:00 | 0 | 0 | 0 | 0 |
| 27.06.2016 02:00 - 03:00 | 0 | 0 | 0 | 0 |
| 27.06.2016 03:00 - 04:00 | 0 | 0 | 0 | 0 |
| 27.06.2016 04:00 - 05:00 | 0 | 0 | 0 | 0 |
| 27.06.2016 05:00 - 06:00 | 0 | 0 | 0 | 0 |
| 27.06.2016 06:00 - 07:00 | 0 | 0 | 0 | 0 |
| 27.06.2016 07:00 - 08:00 | 0 | 0 | 0 | 0 |
| 27.06.2016 08:00 - 09:00 | 0 | 0 | 0 | 0 |
| 27.06.2016 09:00 - 10:00 | 0 | 0 | 0 | 0 |
| 27.06.2016 10:00 - 11:00 | 0 | 0 | 0 | 0 |
| 27.06.2016 11:00 - 12:00 | 0 | 0 | 0 | 0 |
| 27.06.2016 12:00 - 13:00 | 0 | 0 | 0 | 0 |
| 27.06.2016 13:00 - 14:00 | 0 | 0 | 0 | 0 |
| 27.06.2016 14:00 - 15:00 | 0 | 0 | 0 | 0 |
| 27.06.2016 15:00 - 16:00 | 0 | 0 | 0 | 0 |
| 27.06.2016 16:00 - 17:00 | 0 | 0 | 0 | 0 |
| 27.06.2016 17:00 - 18:00 | 0 | 0 | 0 | 0 |
| 27.06.2016 18:00 - 19:00 | 0 | 0 | 0 | 0 |
| 27.06.2016 19:00 - 20:00 | 0 | 0 | 0 | 0 |
| 27.06.2016 20:00 - 21:00 | 0 | 0 | 0 | 0 |
| 27.06.2016 21:00 - 22:00 | 0 | 0 | 0 | 0 |
| 27.06.2016 22:00 - 23:00 | 0 | 0 | 0 | 0 |
| 27.06.2016 23:00 - 24:00 | 0 | 0 | 0 | 0 |
| 28.06.2016 00:00 - 01:00 | 0 | 0 | 0 | 0 |
| 28.06.2016 01:00 - 02:00 | 0 | 0 | 0 | 0 |
| 28.06.2016 02:00 - 03:00 | 0 | 0 | 0 | 0 |
| 28.06.2016 03:00 - 04:00 | 0 | 0 | 0 | 0 |
| 28.06.2016 04:00 - 05:00 | 0 | 0 | 0 | 0 |
| 28.06.2016 05:00 - 06:00 | 0 | 0 | 0 | 0 |
| 28.06.2016 06:00 - 07:00 | 0 | 0 | 0 | 0 |
| 28.06.2016 07:00 - 08:00 | 0 | 0 | 0 | 0 |
| 28.06.2016 08:00 - 09:00 | 0 | 0 | 0 | 0 |
| 28.06.2016 09:00 - 10:00 | 0 | 0 | 0 | 0 |
| 28.06.2016 10:00 - 11:00 | 0 | 0 | 0 | 0 |
| 28.06.2016 11:00 - 12:00 | 0 | 0 | 0 | 0 |
| 28.06.2016 12:00 - 13:00 | 0 | 0 | 0 | 0 |
| 28.06.2016 13:00 - 14:00 | 0 | 0 | 0 | 0 |
| 28.06.2016 14:00 - 15:00 | 0 | 0 | 0 | 0 |
| 28.06.2016 15:00 - 16:00 | 0 | 0 | 0 | 0 |
| 28.06.2016 16:00 - 17:00 | 0 | 0 | 0 | 0 |
| 28.06.2016 17:00 - 18:00 | 0 | 0 | 0 | 0 |
| 28.06.2016 18:00 - 19:00 | 0 | 0 | 0 | 0 |
| 28.06.2016 19:00 - 20:00 | 0 | 0 | 0 | 0 |
| 28.06.2016 20:00 - 21:00 | 0 | 0 | 0 | 0 |
| 28.06.2016 21:00 - 22:00 | 0 | 0 | 0 | 0 |
| 28.06.2016 22:00 - 23:00 | 0 | 0 | 0 | 0 |
| 28.06.2016 23:00 - 24:00 | 0 | 0 | 0 | 0 |
| 29.06.2016 00:00 - 01:00 | 0 | 0 | 0 | 0 |
| 29.06.2016 01:00 - 02:00 | 0 | 0 | 0 | 0 |
| 29.06.2016 02:00 - 03:00 | 0 | 0 | 0 | 0 |
| 29.06.2016 03:00 - 04:00 | 0 | 0 | 0 | 0 |
| 29.06.2016 04:00 - 05:00 | 0 | 0 | 0 | 0 |
| 29.06.2016 05:00 - 06:00 | 0 | 0 | 0 | 0 |
| 29.06.2016 06:00 - 07:00 | 0 | 0 | 0 | 0 |
| 29.06.2016 07:00 - 08:00 | 0 | 0 | 0 | 0 |
| 29.06.2016 08:00 - 09:00 | 0 | 0 | 0 | 0 |
| 29.06.2016 09:00 - 10:00 | 0 | 0 | 0 | 0 |
| 29.06.2016 10:00 - 11:00 | 0 | 0 | 0 | 0 |
| 29.06.2016 11:00 - 12:00 | 0 | 0 | 0 | 0 |
| 29.06.2016 12:00 - 13:00 | 0 | 0 | 0 | 0 |
| 29.06.2016 13:00 - 14:00 | 0 | 0 | 0 | 0 |
| 29.06.2016 14:00 - 15:00 | 0 | 0 | 0 | 0 |
| 29.06.2016 15:00 - 16:00 | 0 | 0 | 0 | 0 |
| 29.06.2016 16:00 - 17:00 | 0 | 0 | 0 | 0 |
| 29.06.2016 17:00 - 18:00 | 0 | 0 | 0 | 0 |
| 29.06.2016 18:00 - 19:00 | 0 | 0 | 0 | 0 |
| 29.06.2016 19:00 - 20:00 | 0 | 0 | 0 | 0 |
| 29.06.2016 20:00 - 21:00 | 0 | 0 | 0 | 0 |
| 29.06.2016 21:00 - 22:00 | 0 | 0 | 0 | 0 |
| 29.06.2016 22:00 - 23:00 | 0 | 0 | 0 | 0 |
| 29.06.2016 23:00 - 24:00 | 0 | 0 | 0 | 0 |
| 30.06.2016 00:00 - 01:00 | 0 | 0 | 0 | 0 |
| 30.06.2016 01:00 - 02:00 | 0 | 0 | 0 | 0 |
| 30.06.2016 02:00 - 03:00 | 0 | 0 | 0 | 0 |
| 30.06.2016 03:00 - 04:00 | 0 | 0 | 0 | 0 |
| 30.06.2016 04:00 - 05:00 | 0 | 0 | 0 | 0 |
| 30.06.2016 05:00 - 06:00 | 0 | 0 | 0 | 0 |
| 30.06.2016 06:00 - 07:00 | 0 | 0 | 0 | 0 |
| 30.06.2016 07:00 - 08:00 | 0 | 0 | 0 | 0 |
| 30.06.2016 08:00 - 09:00 | 0 | 0 | 0 | 0 |
| 30.06.2016 09:00 - 10:00 | 0 | 0 | 0 | 0 |
| 30.06.2016 10:00 - 11:00 | 0 | 0 | 0 | 0 |
| 30.06.2016 11:00 - 12:00 | 0 | 0 | 0 | 0 |
| 30.06.2016 12:00 - 13:00 | 0 | 0 | 0 | 0 |
| 30.06.2016 13:00 - 14:00 | 0 | 0 | 0 | 0 |
| 30.06.2016 14:00 - 15:00 | 0 | 0 | 0 | 0 |
| 30.06.2016 15:00 - 16:00 | 0 | 0 | 0 | 0 |
| 30.06.2016 16:00 - 17:00 | 0 | 0 | 0 | 0 |
| 30.06.2016 17:00 - 18:00 | 0 | 0 | 0 | 0 |
| 30.06.2016 18:00 - 19:00 | 0 | 0 | 0 | 0 |
| 30.06.2016 19:00 - 20:00 | 0 | 0 | 0 | 0 |
| 30.06.2016 20:00 - 21:00 | 0 | 0 | 0 | 0 |
| 30.06.2016 21:00 - 22:00 | 0 | 0 | 0 | 0 |
| 30.06.2016 22:00 - 23:00 | 0 | 0 | 0 | 0 |
| 30.06.2016 23:00 - 24:00 | 0 | 0 | 0 | 0 |
| 01.07.2016 00:00 - 01:00 | 0 | 0 | 0 | 0 |
| 01.07.2016 01:00 - 02:00 | 0 | 0 | 0 | 0 |
| 01.07.2016 02:00 - 03:00 | 0 | 0 | 0 | 0 |
| 01.07.2016 03:00 - 04:00 | 0 | 0 | 0 | 0 |
| 01.07.2016 04:00 - 05:00 | 0 | 0 | 0 | 0 |
| 01.07.2016 05:00 - 06:00 | 0 | 0 | 0 | 0 |